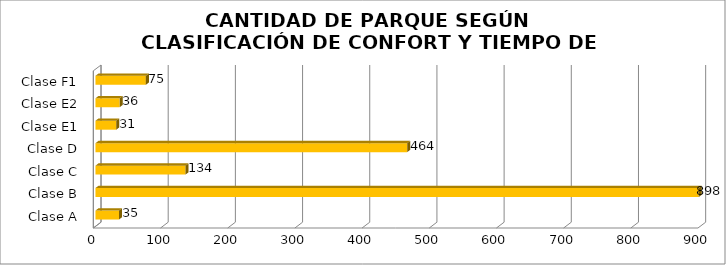
| Category | Series 0 |
|---|---|
| Clase A | 35 |
| Clase B | 898 |
| Clase C | 134 |
| Clase D | 464 |
| Clase E1 | 31 |
| Clase E2 | 36 |
| Clase F1 | 75 |